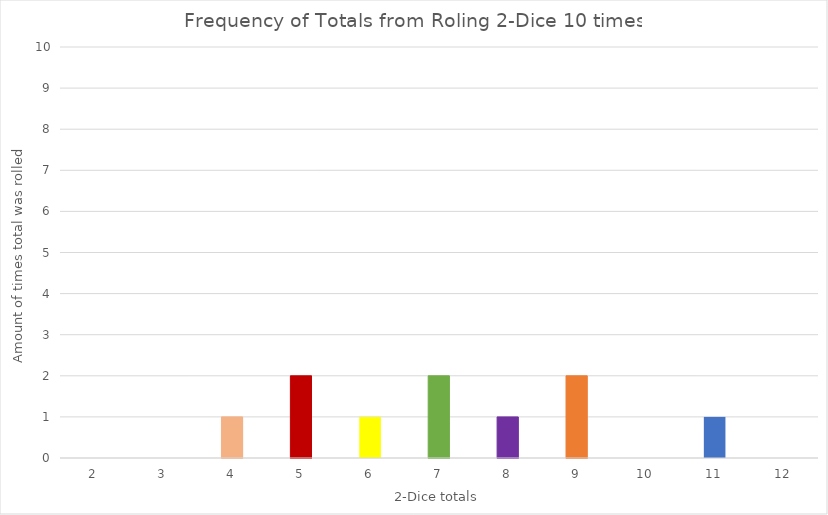
| Category | Frequency |
|---|---|
| 2.0 | 0 |
| 3.0 | 0 |
| 4.0 | 1 |
| 5.0 | 2 |
| 6.0 | 1 |
| 7.0 | 2 |
| 8.0 | 1 |
| 9.0 | 2 |
| 10.0 | 0 |
| 11.0 | 1 |
| 12.0 | 0 |